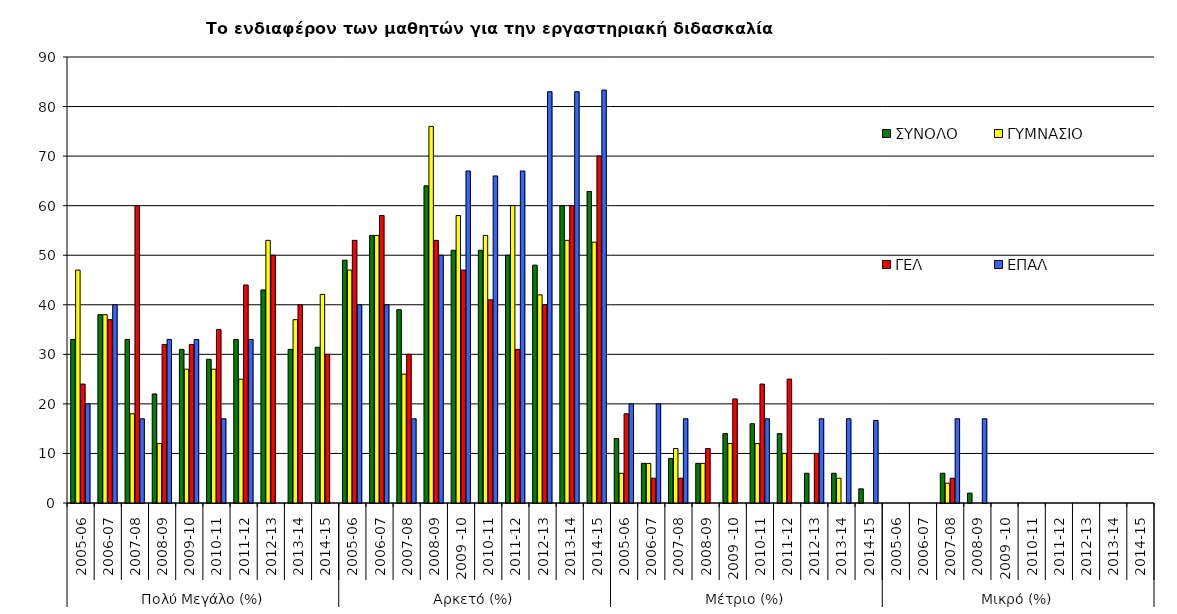
| Category | ΣΥΝΟΛΟ | ΓΥΜΝΑΣΙΟ | ΓΕΛ | ΕΠΑΛ |
|---|---|---|---|---|
| 0 | 33 | 47 | 24 | 20 |
| 1 | 38 | 38 | 37 | 40 |
| 2 | 33 | 18 | 60 | 17 |
| 3 | 22 | 12 | 32 | 33 |
| 4 | 31 | 27 | 32 | 33 |
| 5 | 29 | 27 | 35 | 17 |
| 6 | 33 | 25 | 44 | 33 |
| 7 | 43 | 53 | 50 | 0 |
| 8 | 31 | 37 | 40 | 0 |
| 9 | 31.429 | 42.105 | 30 | 0 |
| 10 | 49 | 47 | 53 | 40 |
| 11 | 54 | 54 | 58 | 40 |
| 12 | 39 | 26 | 30 | 17 |
| 13 | 64 | 76 | 53 | 50 |
| 14 | 51 | 58 | 47 | 67 |
| 15 | 51 | 54 | 41 | 66 |
| 16 | 50 | 60 | 31 | 67 |
| 17 | 48 | 42 | 40 | 83 |
| 18 | 60 | 53 | 60 | 83 |
| 19 | 62.857 | 52.632 | 70 | 83.333 |
| 20 | 13 | 6 | 18 | 20 |
| 21 | 8 | 8 | 5 | 20 |
| 22 | 9 | 11 | 5 | 17 |
| 23 | 8 | 8 | 11 | 0 |
| 24 | 14 | 12 | 21 | 0 |
| 25 | 16 | 12 | 24 | 17 |
| 26 | 14 | 10 | 25 | 0 |
| 27 | 6 | 0 | 10 | 17 |
| 28 | 6 | 5 | 0 | 17 |
| 29 | 2.857 | 0 | 0 | 16.667 |
| 30 | 0 | 0 | 0 | 0 |
| 31 | 0 | 0 | 0 | 0 |
| 32 | 6 | 4 | 5 | 17 |
| 33 | 2 | 0 | 0 | 17 |
| 34 | 0 | 0 | 0 | 0 |
| 35 | 0 | 0 | 0 | 0 |
| 36 | 0 | 0 | 0 | 0 |
| 37 | 0 | 0 | 0 | 0 |
| 38 | 0 | 0 | 0 | 0 |
| 39 | 0 | 0 | 0 | 0 |